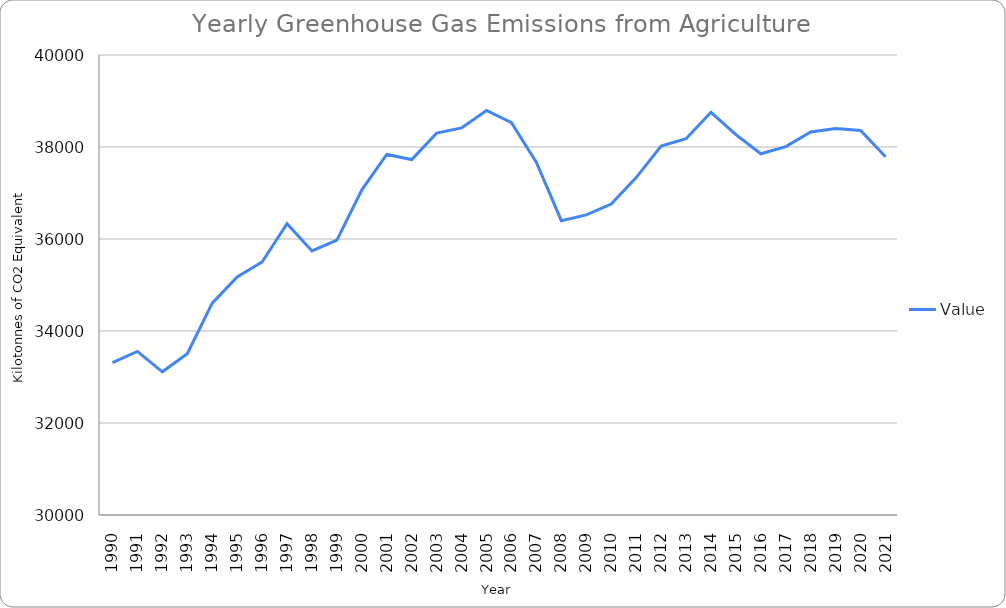
| Category | Value |
|---|---|
| 1990.0 | 33312.05 |
| 1991.0 | 33557.06 |
| 1992.0 | 33113.29 |
| 1993.0 | 33506.03 |
| 1994.0 | 34605.1 |
| 1995.0 | 35176.37 |
| 1996.0 | 35500.52 |
| 1997.0 | 36330.83 |
| 1998.0 | 35740.37 |
| 1999.0 | 35974.61 |
| 2000.0 | 37068.76 |
| 2001.0 | 37837.17 |
| 2002.0 | 37727.75 |
| 2003.0 | 38300.97 |
| 2004.0 | 38414.97 |
| 2005.0 | 38794.31 |
| 2006.0 | 38529.26 |
| 2007.0 | 37663.2 |
| 2008.0 | 36398.58 |
| 2009.0 | 36525.28 |
| 2010.0 | 36759.84 |
| 2011.0 | 37334.44 |
| 2012.0 | 38019.05 |
| 2013.0 | 38179.95 |
| 2014.0 | 38755.23 |
| 2015.0 | 38269.38 |
| 2016.0 | 37853.52 |
| 2017.0 | 38007.76 |
| 2018.0 | 38326 |
| 2019.0 | 38399.83 |
| 2020.0 | 38360.19 |
| 2021.0 | 37786.14 |